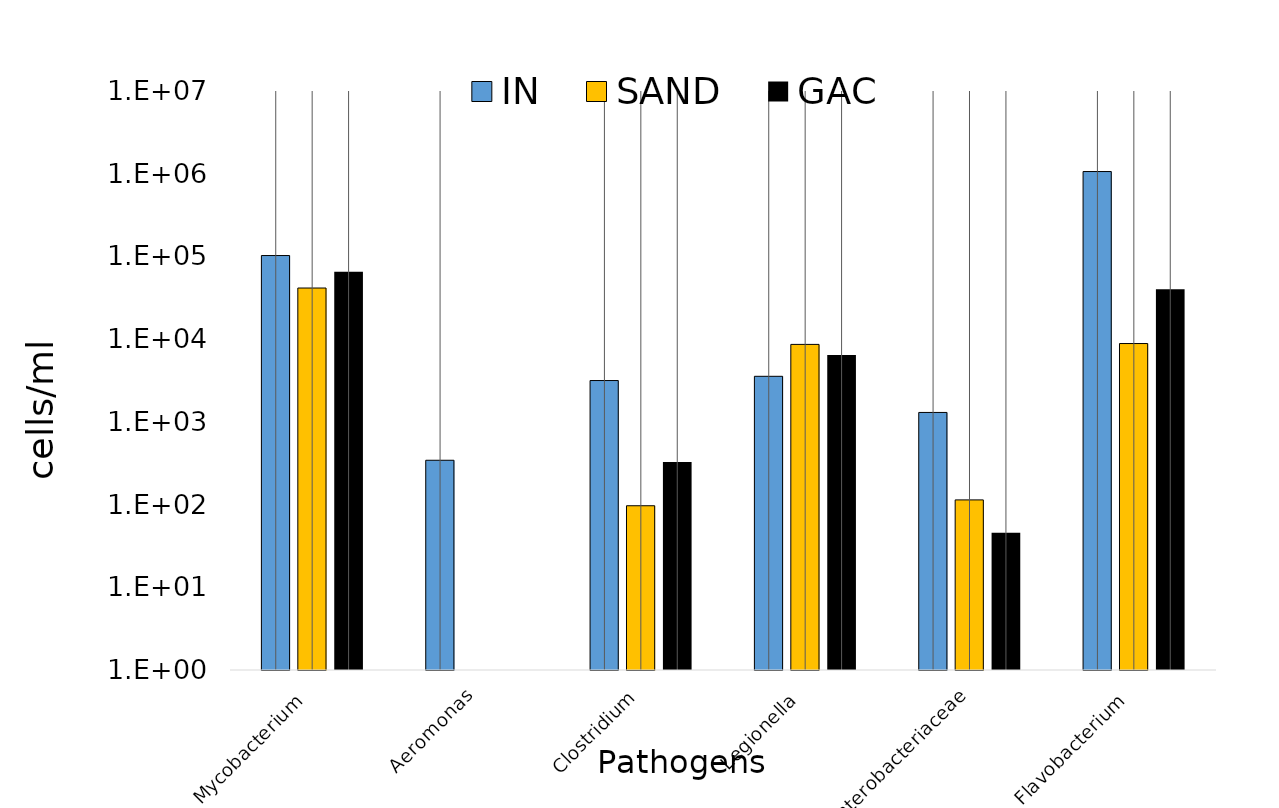
| Category | IN | SAND | GAC |
|---|---|---|---|
| Mycobacterium  | 102512.228 | 41495.171 | 65099.59 |
| Aeromonas | 343.388 | 0 | 0 |
| Clostridium | 3159.068 | 96.778 | 326.655 |
| Legionella  | 3554.091 | 8638.264 | 6424.961 |
| Enterobacteriaceae | 1299.574 | 113.873 | 45.597 |
| Flavobacterium  | 1062465.496 | 8849.441 | 40155.269 |